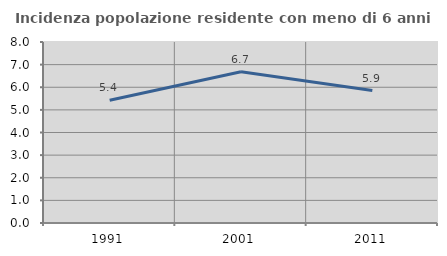
| Category | Incidenza popolazione residente con meno di 6 anni |
|---|---|
| 1991.0 | 5.426 |
| 2001.0 | 6.684 |
| 2011.0 | 5.854 |